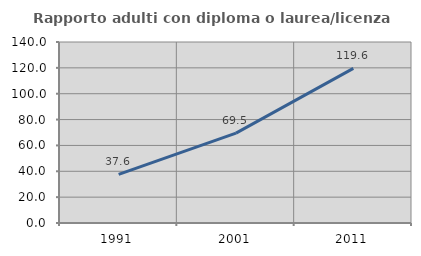
| Category | Rapporto adulti con diploma o laurea/licenza media  |
|---|---|
| 1991.0 | 37.603 |
| 2001.0 | 69.478 |
| 2011.0 | 119.598 |